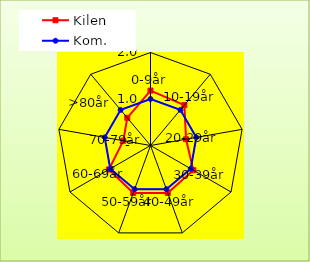
| Category | Kilen | Kom. |
|---|---|---|
| 0-9år | 1.181 | 1 |
| 10-19år | 1.133 | 1 |
| 20-29år | 0.776 | 1 |
| 30-39år | 1.063 | 1 |
| 40-49år | 1.086 | 1 |
| 50-59år | 1.085 | 1 |
| 60-69år | 1.033 | 1 |
| 70-79år | 0.594 | 1 |
| >80år | 0.777 | 1 |